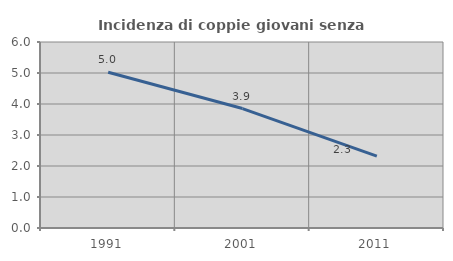
| Category | Incidenza di coppie giovani senza figli |
|---|---|
| 1991.0 | 5.024 |
| 2001.0 | 3.854 |
| 2011.0 | 2.316 |